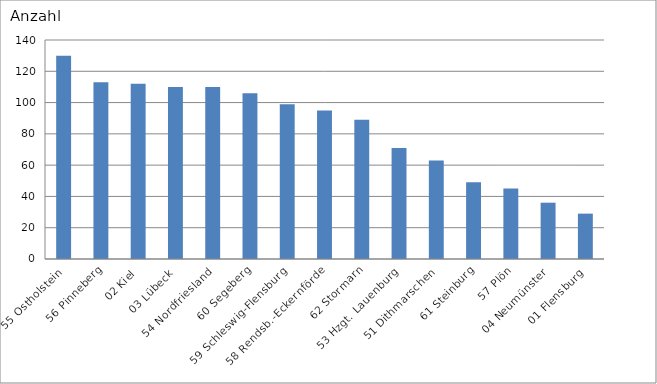
| Category | 55 Ostholstein 56 Pinneberg 02 Kiel 03 Lübeck 54 Nordfriesland 60 Segeberg 59 Schleswig-Flensburg 58 Rendsb.-Eckernförde 62 Stormarn 53 Hzgt. Lauenburg 51 Dithmarschen 61 Steinburg 57 Plön 04 Neumünster 01 Flensburg |
|---|---|
| 55 Ostholstein | 130 |
| 56 Pinneberg | 113 |
| 02 Kiel | 112 |
| 03 Lübeck | 110 |
| 54 Nordfriesland | 110 |
| 60 Segeberg | 106 |
| 59 Schleswig-Flensburg | 99 |
| 58 Rendsb.-Eckernförde | 95 |
| 62 Stormarn | 89 |
| 53 Hzgt. Lauenburg | 71 |
| 51 Dithmarschen | 63 |
| 61 Steinburg | 49 |
| 57 Plön | 45 |
| 04 Neumünster | 36 |
| 01 Flensburg | 29 |